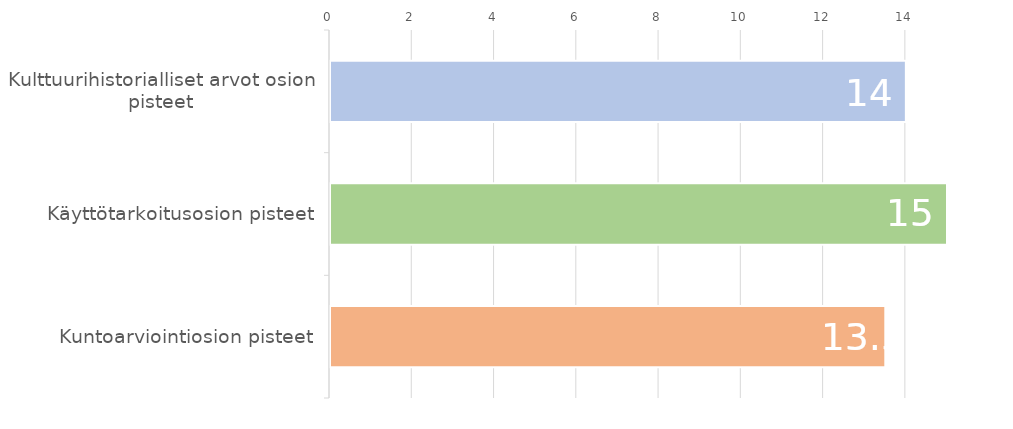
| Category | Series 0 |
|---|---|
| Kulttuurihistorialliset arvot osion pisteet | 14 |
| Käyttötarkoitusosion pisteet | 15 |
| Kuntoarviointiosion pisteet | 13.5 |